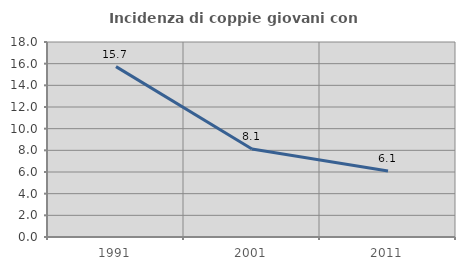
| Category | Incidenza di coppie giovani con figli |
|---|---|
| 1991.0 | 15.725 |
| 2001.0 | 8.123 |
| 2011.0 | 6.098 |